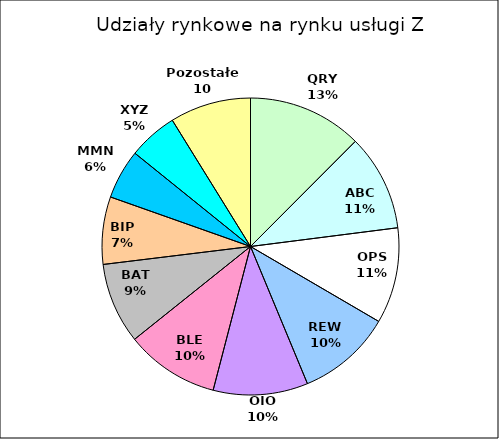
| Category | Sprzedaż |
|---|---|
| QRY | 1100 |
| ABC | 926.542 |
| OPS | 920 |
| REW | 910 |
| OIO | 909.35 |
| BLE | 900 |
| BAT | 777 |
| BIP | 647.453 |
| MMN | 475.7 |
| XYZ | 473.418 |
| Pozostałe 10 | 778.279 |